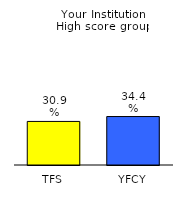
| Category | Series 0 |
|---|---|
| TFS | 0.309 |
| YFCY | 0.344 |